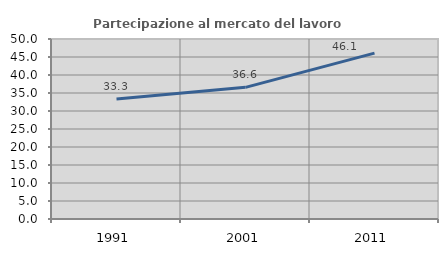
| Category | Partecipazione al mercato del lavoro  femminile |
|---|---|
| 1991.0 | 33.333 |
| 2001.0 | 36.573 |
| 2011.0 | 46.085 |